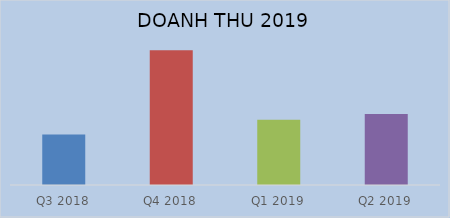
| Category | Doanh thu thuần |
|---|---|
| Q3 2018 | 696296096839 |
| Q4 2018 | 1858155431924 |
| Q1 2019 | 901223235835 |
| Q2 2019 | 977825159089 |